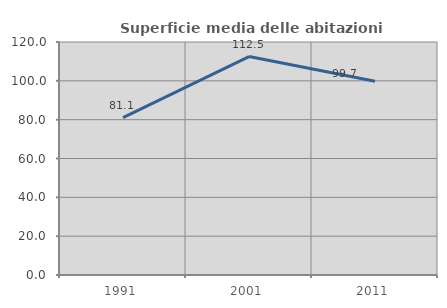
| Category | Superficie media delle abitazioni occupate |
|---|---|
| 1991.0 | 81.05 |
| 2001.0 | 112.509 |
| 2011.0 | 99.746 |